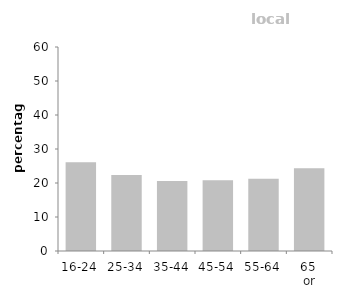
| Category | local authority |
|---|---|
| 16-24 | 26.104 |
| 25-34 | 22.333 |
| 35-44 | 20.56 |
| 45-54 | 20.827 |
| 55-64 | 21.235 |
| 65 
or over | 24.343 |